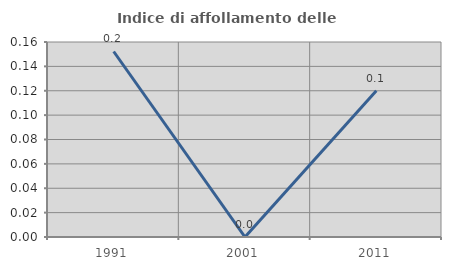
| Category | Indice di affollamento delle abitazioni  |
|---|---|
| 1991.0 | 0.152 |
| 2001.0 | 0 |
| 2011.0 | 0.12 |